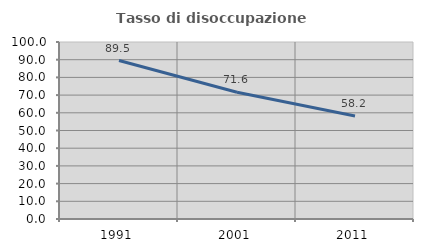
| Category | Tasso di disoccupazione giovanile  |
|---|---|
| 1991.0 | 89.541 |
| 2001.0 | 71.598 |
| 2011.0 | 58.228 |